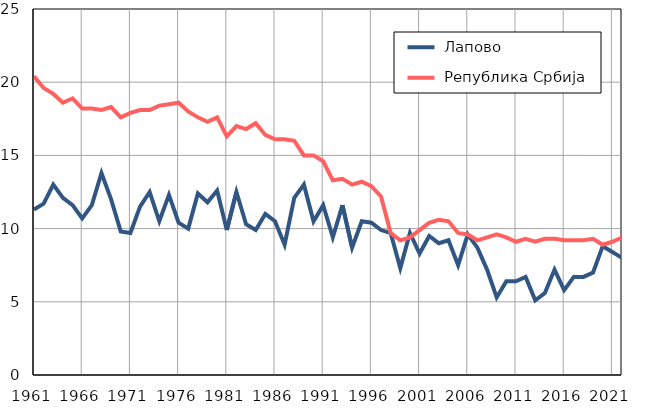
| Category |  Лапово |  Република Србија |
|---|---|---|
| 1961.0 | 11.3 | 20.4 |
| 1962.0 | 11.7 | 19.6 |
| 1963.0 | 13 | 19.2 |
| 1964.0 | 12.1 | 18.6 |
| 1965.0 | 11.6 | 18.9 |
| 1966.0 | 10.7 | 18.2 |
| 1967.0 | 11.6 | 18.2 |
| 1968.0 | 13.8 | 18.1 |
| 1969.0 | 12 | 18.3 |
| 1970.0 | 9.8 | 17.6 |
| 1971.0 | 9.7 | 17.9 |
| 1972.0 | 11.5 | 18.1 |
| 1973.0 | 12.5 | 18.1 |
| 1974.0 | 10.5 | 18.4 |
| 1975.0 | 12.3 | 18.5 |
| 1976.0 | 10.4 | 18.6 |
| 1977.0 | 10 | 18 |
| 1978.0 | 12.4 | 17.6 |
| 1979.0 | 11.8 | 17.3 |
| 1980.0 | 12.6 | 17.6 |
| 1981.0 | 9.9 | 16.3 |
| 1982.0 | 12.5 | 17 |
| 1983.0 | 10.3 | 16.8 |
| 1984.0 | 9.9 | 17.2 |
| 1985.0 | 11 | 16.4 |
| 1986.0 | 10.5 | 16.1 |
| 1987.0 | 8.9 | 16.1 |
| 1988.0 | 12.1 | 16 |
| 1989.0 | 13 | 15 |
| 1990.0 | 10.5 | 15 |
| 1991.0 | 11.6 | 14.6 |
| 1992.0 | 9.4 | 13.3 |
| 1993.0 | 11.6 | 13.4 |
| 1994.0 | 8.7 | 13 |
| 1995.0 | 10.5 | 13.2 |
| 1996.0 | 10.4 | 12.9 |
| 1997.0 | 9.9 | 12.2 |
| 1998.0 | 9.7 | 9.7 |
| 1999.0 | 7.3 | 9.2 |
| 2000.0 | 9.7 | 9.4 |
| 2001.0 | 8.3 | 9.9 |
| 2002.0 | 9.5 | 10.4 |
| 2003.0 | 9 | 10.6 |
| 2004.0 | 9.2 | 10.5 |
| 2005.0 | 7.5 | 9.7 |
| 2006.0 | 9.6 | 9.6 |
| 2007.0 | 8.7 | 9.2 |
| 2008.0 | 7.2 | 9.4 |
| 2009.0 | 5.3 | 9.6 |
| 2010.0 | 6.4 | 9.4 |
| 2011.0 | 6.4 | 9.1 |
| 2012.0 | 6.7 | 9.3 |
| 2013.0 | 5.1 | 9.1 |
| 2014.0 | 5.6 | 9.3 |
| 2015.0 | 7.2 | 9.3 |
| 2016.0 | 5.8 | 9.2 |
| 2017.0 | 6.7 | 9.2 |
| 2018.0 | 6.7 | 9.2 |
| 2019.0 | 7 | 9.3 |
| 2020.0 | 8.8 | 8.9 |
| 2021.0 | 8.4 | 9.1 |
| 2022.0 | 8 | 9.4 |